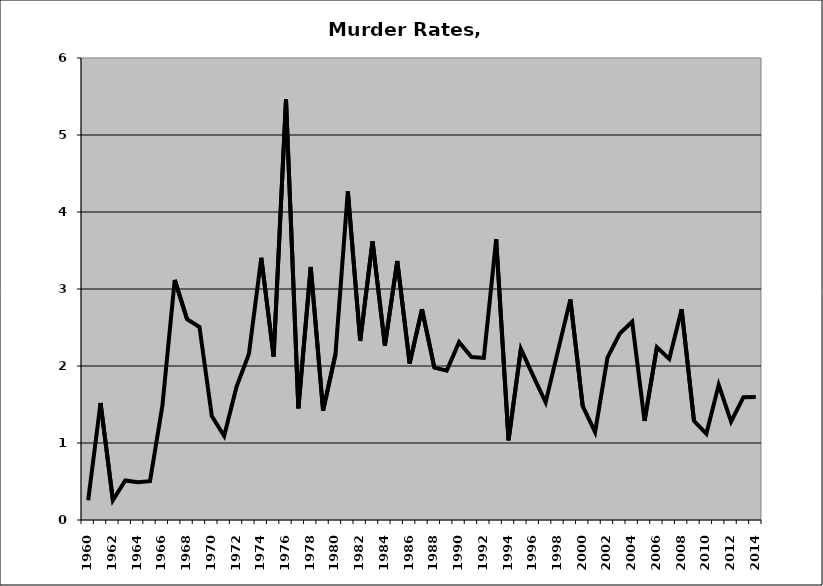
| Category | Murder |
|---|---|
| 1960.0 | 0.256 |
| 1961.0 | 1.519 |
| 1962.0 | 0.256 |
| 1963.0 | 0.513 |
| 1964.0 | 0.489 |
| 1965.0 | 0.504 |
| 1966.0 | 1.481 |
| 1967.0 | 3.118 |
| 1968.0 | 2.607 |
| 1969.0 | 2.506 |
| 1970.0 | 1.349 |
| 1971.0 | 1.092 |
| 1972.0 | 1.732 |
| 1973.0 | 2.155 |
| 1974.0 | 3.404 |
| 1975.0 | 2.123 |
| 1976.0 | 5.462 |
| 1977.0 | 1.449 |
| 1978.0 | 3.285 |
| 1979.0 | 1.42 |
| 1980.0 | 2.151 |
| 1981.0 | 4.272 |
| 1982.0 | 2.326 |
| 1983.0 | 3.619 |
| 1984.0 | 2.264 |
| 1985.0 | 3.364 |
| 1986.0 | 2.033 |
| 1987.0 | 2.737 |
| 1988.0 | 1.978 |
| 1989.0 | 1.94 |
| 1990.0 | 2.31 |
| 1991.0 | 2.116 |
| 1992.0 | 2.105 |
| 1993.0 | 3.646 |
| 1994.0 | 1.034 |
| 1995.0 | 2.222 |
| 1996.0 | 1.868 |
| 1997.0 | 1.528 |
| 1998.0 | 2.2 |
| 1999.0 | 2.863 |
| 2000.0 | 1.478 |
| 2001.0 | 1.142 |
| 2002.0 | 2.109 |
| 2003.0 | 2.422 |
| 2004.0 | 2.576 |
| 2005.0 | 1.285 |
| 2006.0 | 2.244 |
| 2007.0 | 2.093 |
| 2008.0 | 2.737 |
| 2009.0 | 1.287 |
| 2010.0 | 1.119 |
| 2011.0 | 1.756 |
| 2012.0 | 1.278 |
| 2013.0 | 1.595 |
| 2014.0 | 1.596 |